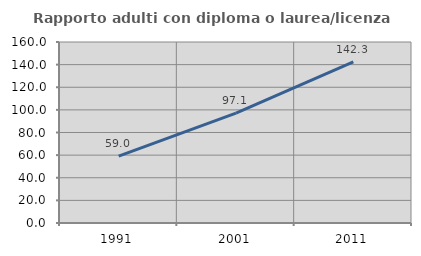
| Category | Rapporto adulti con diploma o laurea/licenza media  |
|---|---|
| 1991.0 | 59.037 |
| 2001.0 | 97.093 |
| 2011.0 | 142.324 |